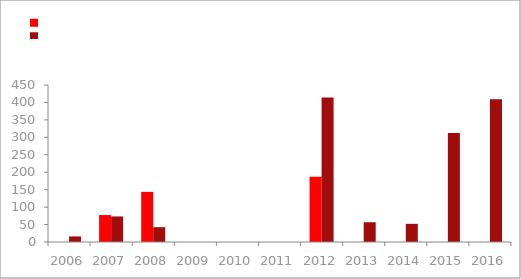
| Category | Musical | History |
|---|---|---|
| 2006.0 | 0 | 15.96 |
| 2007.0 | 77.22 | 73.27 |
| 2008.0 | 143.7 | 42.51 |
| 2009.0 | 0 | 0 |
| 2010.0 | 0 | 0 |
| 2011.0 | 0 | 0 |
| 2012.0 | 187.29 | 413.94 |
| 2013.0 | 0 | 56.67 |
| 2014.0 | 0 | 52.07 |
| 2015.0 | 0 | 312.28 |
| 2016.0 | 0 | 409.32 |